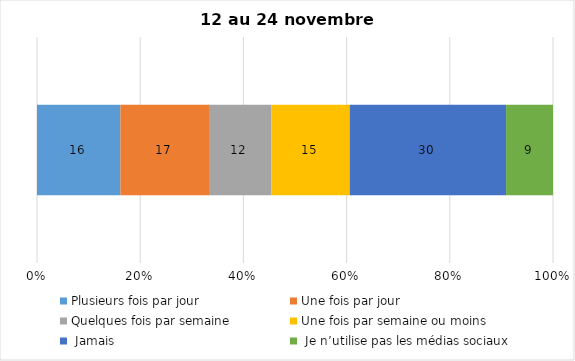
| Category | Plusieurs fois par jour | Une fois par jour | Quelques fois par semaine   | Une fois par semaine ou moins   |  Jamais   |  Je n’utilise pas les médias sociaux |
|---|---|---|---|---|---|---|
| 0 | 16 | 17 | 12 | 15 | 30 | 9 |